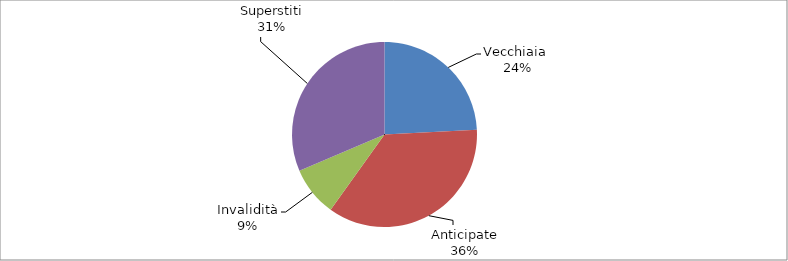
| Category | Series 0 |
|---|---|
| Vecchiaia  | 46963 |
| Anticipate | 69287 |
| Invalidità | 16888 |
| Superstiti | 60958 |